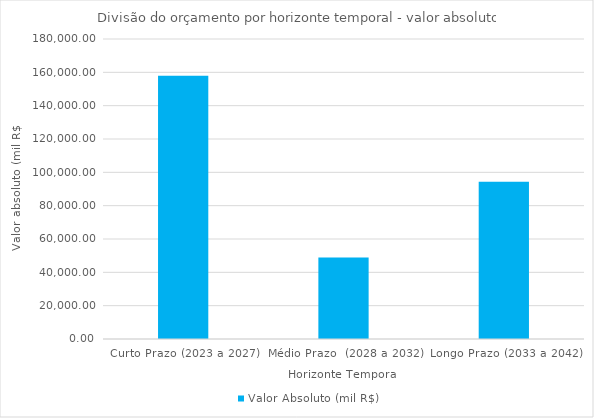
| Category | Valor Absoluto (mil R$) |
|---|---|
| Curto Prazo (2023 a 2027) | 157950.554 |
| Médio Prazo  (2028 a 2032) | 48897.455 |
| Longo Prazo (2033 a 2042) | 94372.144 |